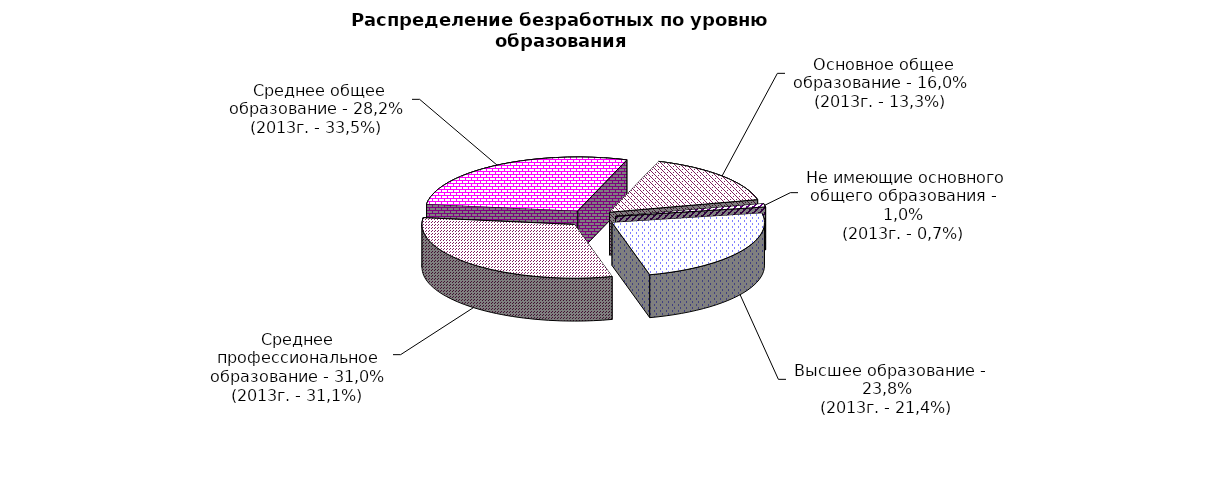
| Category | Series 0 |
|---|---|
|  - высшее образование | 23.8 |
|  - среднее профессиональное образование | 31 |
|  - среднее общее образование | 28.2 |
|  - основное общее образование | 16 |
|  - не имеющие основного общего образования | 1 |